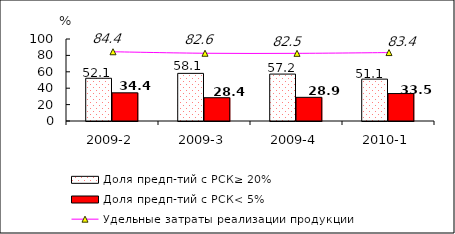
| Category | Доля предп-тий с РСК≥ 20% | Доля предп-тий с РСК< 5% |
|---|---|---|
| 2009-2 | 52.126 | 34.367 |
| 2009-3 | 58.093 | 28.387 |
| 2009-4 | 57.213 | 28.853 |
| 2010-1 | 51.061 | 33.475 |